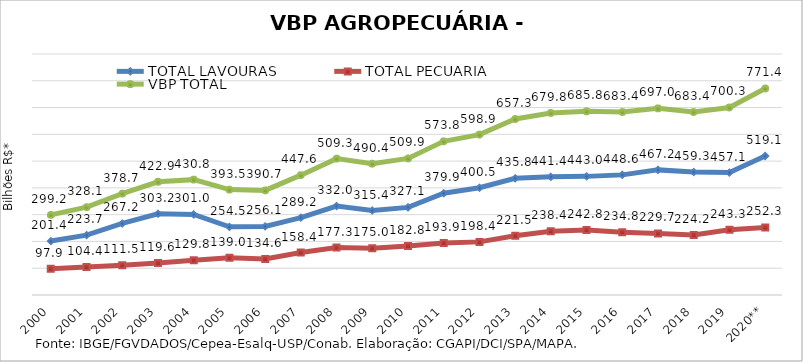
| Category | TOTAL LAVOURAS | TOTAL PECUÁRIA | VBP TOTAL |
|---|---|---|---|
| 2000 | 201.356 | 97.877 | 299.233 |
| 2001 | 223.67 | 104.423 | 328.092 |
| 2002 | 267.181 | 111.472 | 378.653 |
| 2003 | 303.248 | 119.646 | 422.894 |
| 2004 | 301.028 | 129.781 | 430.809 |
| 2005 | 254.506 | 139.027 | 393.533 |
| 2006 | 256.06 | 134.649 | 390.71 |
| 2007 | 289.174 | 158.408 | 447.581 |
| 2008 | 332.043 | 177.296 | 509.339 |
| 2009 | 315.397 | 174.99 | 490.386 |
| 2010 | 327.101 | 182.831 | 509.932 |
| 2011 | 379.887 | 193.936 | 573.824 |
| 2012 | 400.545 | 198.385 | 598.931 |
| 2013 | 435.796 | 221.473 | 657.269 |
| 2014 | 441.403 | 238.368 | 679.771 |
| 2015 | 443.004 | 242.832 | 685.837 |
| 2016 | 448.606 | 234.758 | 683.364 |
| 2017 | 467.245 | 229.714 | 696.959 |
| 2018 | 459.257 | 224.158 | 683.415 |
| 2019 | 457.057 | 243.276 | 700.333 |
| 2020** | 519.086 | 252.273 | 771.359 |